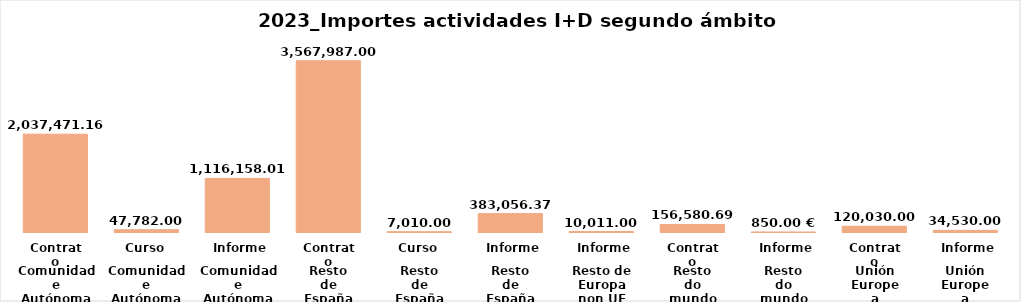
| Category | Series 0 |
|---|---|
| 0 | 2037471.16 |
| 1 | 47782 |
| 2 | 1116158.01 |
| 3 | 3567987 |
| 4 | 7010 |
| 5 | 383056.37 |
| 6 | 10011 |
| 7 | 156580.69 |
| 8 | 850 |
| 9 | 120030 |
| 10 | 34530 |